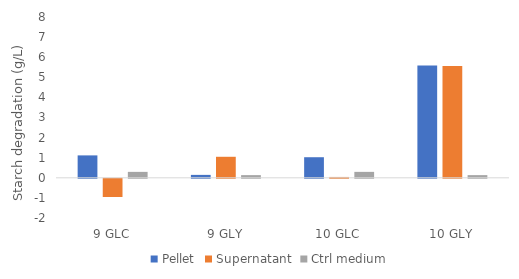
| Category | Pellet | Supernatant | Ctrl medium |
|---|---|---|---|
| 9 GLC | 1.115 | -0.905 | 0.295 |
| 9 GLY | 0.145 | 1.046 | 0.133 |
| 10 GLC | 1.024 | 0.042 | 0.295 |
| 10 GLY | 5.587 | 5.568 | 0.133 |